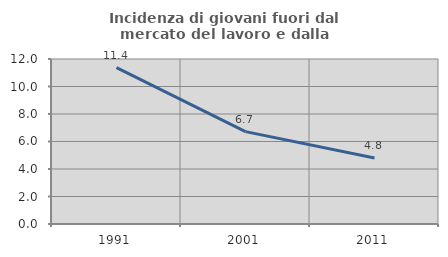
| Category | Incidenza di giovani fuori dal mercato del lavoro e dalla formazione  |
|---|---|
| 1991.0 | 11.379 |
| 2001.0 | 6.716 |
| 2011.0 | 4.805 |